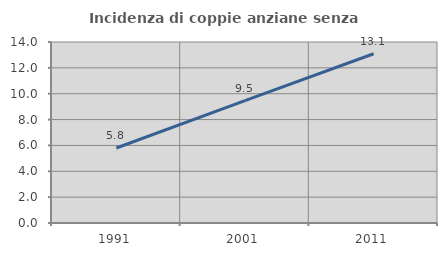
| Category | Incidenza di coppie anziane senza figli  |
|---|---|
| 1991.0 | 5.8 |
| 2001.0 | 9.469 |
| 2011.0 | 13.089 |